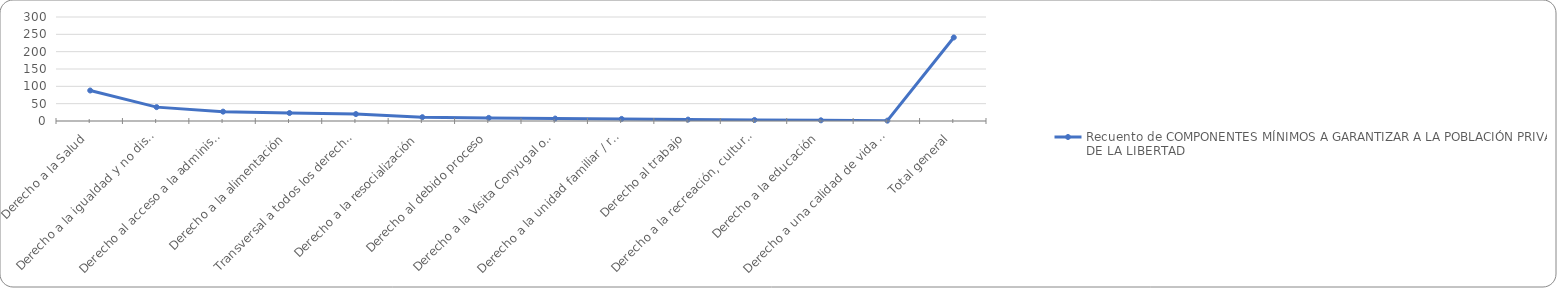
| Category | Recuento de COMPONENTES MÍNIMOS A GARANTIZAR A LA POBLACIÓN PRIVADA DE LA LIBERTAD |
|---|---|
| Derecho a la Salud | 88 |
| Derecho a la igualdad y no discriminación | 40 |
| Derecho al acceso a la administración pública, la justicia y el debido proceso | 27 |
| Derecho a la alimentación | 23 |
| Transversal a todos los derechos en el marco del ECI | 20 |
| Derecho a la resocialización | 11 |
| Derecho al debido proceso | 9 |
| Derecho a la Visita Conyugal o Intima (Derecho contacto familiar) | 7 |
| Derecho a la unidad familiar / resocialización | 6 |
| Derecho al trabajo | 4 |
| Derecho a la recreación, cultura y deporte | 3 |
| Derecho a la educación | 2 |
| Derecho a una calidad de vida digna | 1 |
| Total general | 241 |